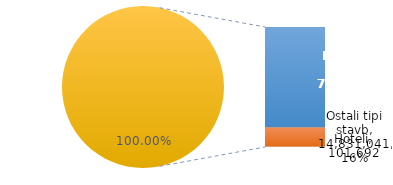
| Category | Series 0 |
|---|---|
| Preostale občine | 77235980 |
| Ostali tipi stavb | 14831040.9 |
| Hoteli | 101691.7 |